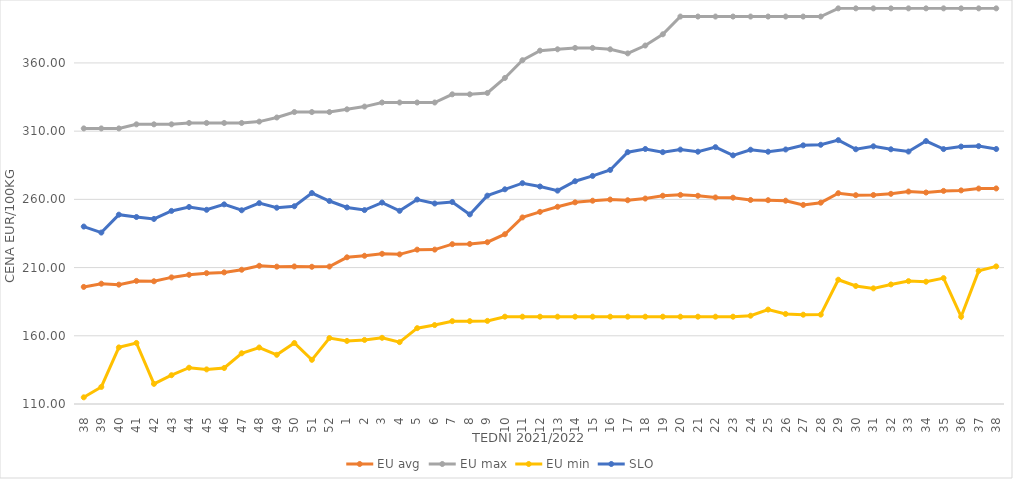
| Category | EU avg | EU max | EU min | SLO |
|---|---|---|---|---|
| 38.0 | 195.821 | 312 | 114.892 | 240.06 |
| 39.0 | 198.179 | 312 | 122.517 | 235.66 |
| 40.0 | 197.482 | 312 | 151.488 | 248.77 |
| 41.0 | 200.22 | 315 | 154.74 | 247.07 |
| 42.0 | 199.965 | 315 | 124.748 | 245.64 |
| 43.0 | 202.804 | 315 | 131.104 | 251.53 |
| 44.0 | 204.713 | 316 | 136.6 | 254.42 |
| 45.0 | 205.906 | 316 | 135.362 | 252.35 |
| 46.0 | 206.476 | 316 | 136.39 | 256.33 |
| 47.0 | 208.415 | 316 | 147.192 | 252.01 |
| 48.0 | 211.314 | 317 | 151.41 | 257.25 |
| 49.0 | 210.677 | 320 | 146.064 | 253.87 |
| 50.0 | 210.823 | 324 | 154.698 | 254.94 |
| 51.0 | 210.59 | 324 | 142.382 | 264.65 |
| 52.0 | 210.763 | 324 | 158.333 | 258.8 |
| 1.0 | 217.519 | 326 | 156.222 | 254.09 |
| 2.0 | 218.654 | 328 | 156.969 | 252.15 |
| 3.0 | 220.098 | 331 | 158.511 | 257.65 |
| 4.0 | 219.685 | 331 | 155.346 | 251.6 |
| 5.0 | 223.143 | 331 | 165.59 | 259.87 |
| 6.0 | 223.178 | 331 | 167.86 | 256.97 |
| 7.0 | 227.145 | 337 | 170.719 | 258.07 |
| 8.0 | 227.312 | 337 | 170.743 | 248.97 |
| 9.0 | 228.588 | 338 | 170.92 | 262.72 |
| 10.0 | 234.434 | 349 | 174 | 267.38 |
| 11.0 | 246.762 | 362 | 174 | 271.86 |
| 12.0 | 250.845 | 369 | 174 | 269.43 |
| 13.0 | 254.568 | 370 | 174 | 266.39 |
| 14.0 | 257.819 | 371 | 174 | 273.3 |
| 15.0 | 259 | 371 | 174 | 277.18 |
| 16.0 | 259.873 | 370 | 174 | 281.55 |
| 17.0 | 259.351 | 367 | 174 | 294.59 |
| 18.0 | 260.6 | 372.758 | 174 | 296.93 |
| 19.0 | 262.669 | 381 | 174 | 294.6 |
| 20.0 | 263.291 | 394 | 174 | 296.48 |
| 21.0 | 262.64 | 394 | 174 | 294.94 |
| 22.0 | 261.388 | 394 | 174 | 298.26 |
| 23.0 | 261.228 | 394 | 174 | 292.27 |
| 24.0 | 259.544 | 394 | 174.72 | 296.39 |
| 25.0 | 259.395 | 394 | 179.2 | 294.93 |
| 26.0 | 259.018 | 394 | 176 | 296.56 |
| 27.0 | 255.922 | 394 | 175.451 | 299.59 |
| 28.0 | 257.564 | 394 | 175.52 | 300.01 |
| 29.0 | 264.52 | 400 | 201.097 | 303.41 |
| 30.0 | 263.067 | 400 | 196.496 | 296.73 |
| 31.0 | 263.196 | 400 | 194.756 | 298.88 |
| 32.0 | 264.059 | 400 | 197.634 | 296.7 |
| 33.0 | 265.729 | 400 | 200.07 | 295.05 |
| 34.0 | 265.016 | 400 | 199.637 | 302.73 |
| 35.0 | 266.209 | 400 | 202.277 | 296.86 |
| 36.0 | 266.582 | 400 | 174 | 298.7 |
| 37.0 | 267.928 | 400 | 207.594 | 299.02 |
| 38.0 | 268 | 400 | 210.854 | 296.91 |